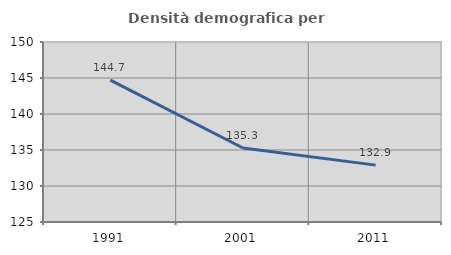
| Category | Densità demografica |
|---|---|
| 1991.0 | 144.713 |
| 2001.0 | 135.281 |
| 2011.0 | 132.899 |